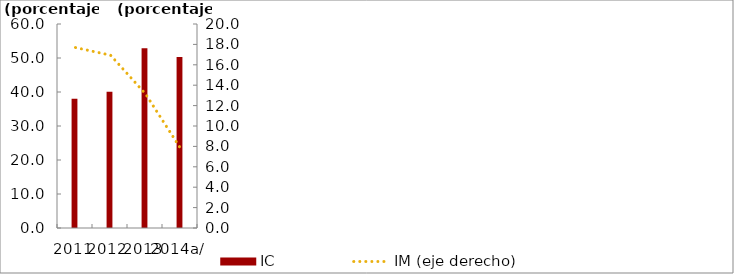
| Category | IC |
|---|---|
| 2011 | 38.039 |
| 2012 | 40.045 |
| 2013 | 52.832 |
| 2014a/ | 50.321 |